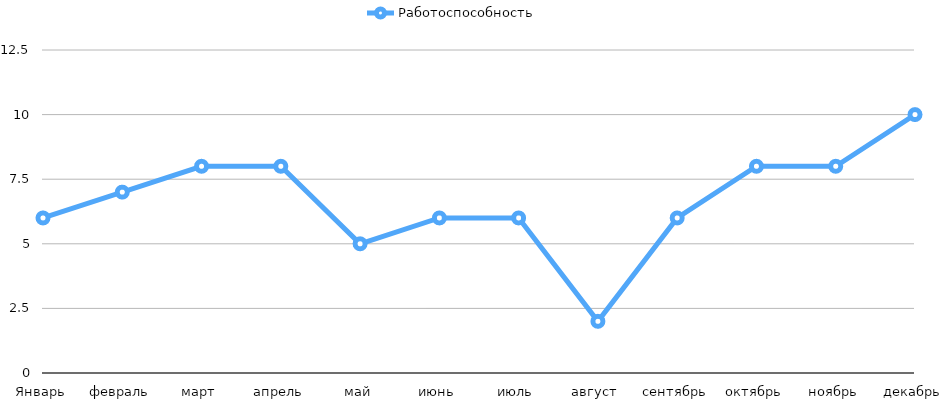
| Category | Работоспособность |
|---|---|
| Январь | 6 |
| февраль | 7 |
| март | 8 |
| апрель | 8 |
| май | 5 |
| июнь | 6 |
| июль | 6 |
| август | 2 |
| сентябрь | 6 |
| октябрь | 8 |
| ноябрь | 8 |
| декабрь | 10 |